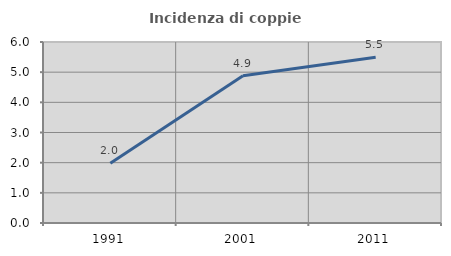
| Category | Incidenza di coppie miste |
|---|---|
| 1991.0 | 1.977 |
| 2001.0 | 4.878 |
| 2011.0 | 5.495 |